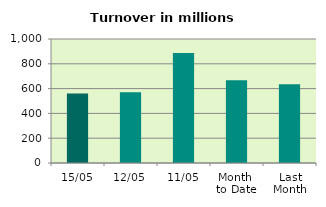
| Category | Series 0 |
|---|---|
| 15/05 | 561.443 |
| 12/05 | 570.051 |
| 11/05 | 887.048 |
| Month 
to Date | 666.546 |
| Last
Month | 634.312 |